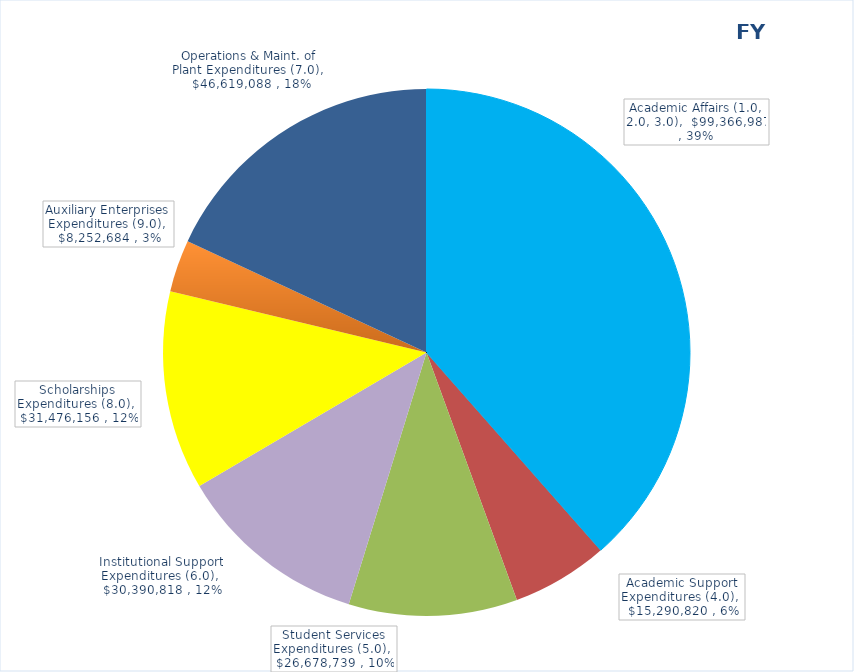
| Category | FY 2021 |
|---|---|
| Academic Affairs (1.0, 2.0, 3.0) | 99366986.68 |
| Academic Support Expenditures (4.0) | 15290819.51 |
| Student Services Expenditures (5.0) | 26678739.36 |
| Institutional Support Expenditures (6.0) | 30390817.81 |
| Scholarships Expenditures (8.0) | 31476155.95 |
| Auxiliary Enterprises Expenditures (9.0) | 8252684.28 |
| Operations & Maint. of Plant Expenditures (7.0) | 46619087.62 |